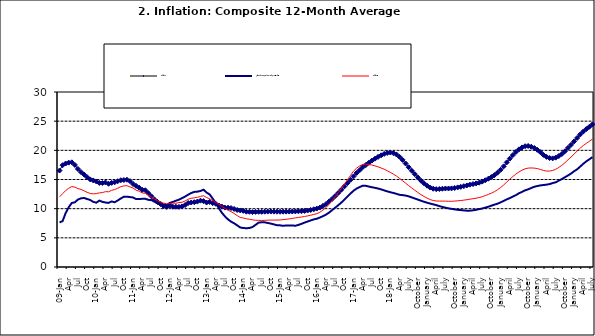
| Category | Series 0 | All Items less Farm Produce and Energy | Series 2 |
|---|---|---|---|
| 09-Jan | 16.536 | 7.643 | 12.032 |
| Feb | 17.454 | 7.869 | 12.567 |
| Mar | 17.742 | 9.25 | 13.101 |
| Apr | 17.89 | 10.241 | 13.51 |
| May | 17.949 | 10.981 | 13.787 |
| June | 17.498 | 11.083 | 13.694 |
| Jul | 16.808 | 11.564 | 13.437 |
| Aug | 16.278 | 11.773 | 13.307 |
| Sep | 15.859 | 11.834 | 13.065 |
| Oct | 15.396 | 11.658 | 12.803 |
| Nov | 15.018 | 11.492 | 12.609 |
| Dec | 14.841 | 11.171 | 12.538 |
| 10-Jan | 14.668 | 11.027 | 12.586 |
| Feb | 14.411 | 11.382 | 12.7 |
| Mar | 14.395 | 11.166 | 12.757 |
| Apr | 14.489 | 11.054 | 12.915 |
| May | 14.266 | 10.986 | 12.893 |
| Jun | 14.424 | 11.243 | 13.132 |
| Jul | 14.514 | 11.094 | 13.284 |
| Aug | 14.706 | 11.408 | 13.5 |
| Sep | 14.872 | 11.749 | 13.764 |
| Oct | 14.906 | 12.042 | 13.908 |
| Nov | 14.967 | 12.063 | 13.928 |
| Dec | 14.723 | 11.985 | 13.74 |
| 11-Jan | 14.233 | 11.923 | 13.542 |
| Feb | 13.903 | 11.643 | 13.161 |
| Mar | 13.606 | 11.651 | 13.001 |
| Apr | 13.227 | 11.687 | 12.694 |
| May | 13.152 | 11.691 | 12.648 |
| Jun | 12.654 | 11.513 | 12.321 |
| Jul | 12.118 | 11.467 | 12.009 |
| Aug | 11.575 | 11.186 | 11.635 |
| Sep | 11.155 | 10.893 | 11.363 |
| Oct | 10.797 | 10.708 | 11.13 |
| Nov | 10.422 | 10.679 | 10.952 |
| Dec | 10.298 | 10.638 | 10.826 |
| 12-Jan | 10.538 | 10.992 | 10.886 |
| 12-Feb | 10.336 | 11.159 | 10.955 |
| 12-Mar | 10.325 | 11.361 | 10.914 |
| Apr | 10.304 | 11.548 | 11.054 |
| May | 10.387 | 11.8 | 11.096 |
| Jun | 10.617 | 12.085 | 11.32 |
| Jul | 10.963 | 12.397 | 11.599 |
| Aug | 11.056 | 12.685 | 11.791 |
| Sep | 11.104 | 12.874 | 11.859 |
| Oct | 11.216 | 12.918 | 11.948 |
| Nov | 11.372 | 13.024 | 12.091 |
| Dec | 11.296 | 13.26 | 12.224 |
| 13-Jan | 11.055 | 12.762 | 11.908 |
| Feb | 11.153 | 12.455 | 11.703 |
| Mar | 10.951 | 11.733 | 11.394 |
| Apr | 10.844 | 10.99 | 11.072 |
| May | 10.548 | 10.09 | 10.761 |
| Jun | 10.352 | 9.301 | 10.383 |
| Jul | 10.186 | 8.681 | 10.047 |
| Aug | 10.168 | 8.164 | 9.761 |
| Sep | 10.105 | 7.78 | 9.486 |
| Oct | 9.955 | 7.487 | 9.167 |
| Nov | 9.774 | 7.141 | 8.815 |
| Dec | 9.695 | 6.777 | 8.496 |
| 14-Jan | 9.626 | 6.685 | 8.408 |
| Feb | 9.484 | 6.648 | 8.257 |
| Mar | 9.464 | 6.687 | 8.19 |
| Apr | 9.416 | 6.852 | 8.092 |
| May | 9.448 | 7.223 | 8.012 |
| Jun | 9.464 | 7.606 | 7.998 |
| Jul | 9.459 | 7.668 | 7.968 |
| Aug | 9.481 | 7.652 | 7.996 |
| Sep | 9.501 | 7.551 | 8.027 |
| Oct | 9.508 | 7.437 | 8.047 |
| Nov | 9.492 | 7.309 | 8.046 |
| Dec | 9.481 | 7.16 | 8.047 |
| 15-Jan | 9.475 | 7.137 | 8.063 |
| Feb | 9.486 | 7.062 | 8.117 |
| Mar | 9.495 | 7.122 | 8.176 |
| Apr | 9.501 | 7.131 | 8.243 |
| May | 9.51 | 7.115 | 8.331 |
| Jun | 9.535 | 7.073 | 8.417 |
| Jul | 9.552 | 7.215 | 8.497 |
| Aug | 9.571 | 7.401 | 8.566 |
| Sep | 9.614 | 7.612 | 8.658 |
| Oct | 9.68 | 7.8 | 8.76 |
| Nov | 9.778 | 7.981 | 8.879 |
| Dec | 9.898 | 8.16 | 9.009 |
| 16-Jan | 10.017 | 8.277 | 9.13 |
| Feb | 10.184 | 8.477 | 9.386 |
| Mar | 10.471 | 8.717 | 9.751 |
| Apr | 10.786 | 8.98 | 10.182 |
| May | 11.221 | 9.325 | 10.746 |
| Jun | 11.672 | 9.749 | 11.372 |
| Jul | 12.162 | 10.167 | 12.045 |
| Aug | 12.696 | 10.594 | 12.744 |
| Sep | 13.238 | 11.043 | 13.454 |
| Oct | 13.817 | 11.544 | 14.206 |
| Nov | 14.386 | 12.074 | 14.958 |
| Dec | 14.946 | 12.589 | 15.697 |
| 17-Jan | 15.536 | 13.081 | 16.441 |
| Feb | 16.127 | 13.445 | 16.958 |
| Mar | 16.598 | 13.706 | 17.315 |
| Apr | 17.106 | 13.94 | 17.591 |
| May | 17.477 | 13.915 | 17.628 |
| Jun | 17.868 | 13.792 | 17.578 |
| Jul | 18.247 | 13.675 | 17.475 |
| Aug | 18.569 | 13.573 | 17.331 |
| Sep | 18.876 | 13.455 | 17.17 |
| Oct | 19.14 | 13.303 | 16.968 |
| Nov | 19.392 | 13.133 | 16.76 |
| Dec | 19.546 | 12.966 | 16.502 |
| 18-Jan | 19.621 | 12.821 | 16.215 |
| Feb | 19.521 | 12.691 | 15.93 |
| Mar | 19.294 | 12.548 | 15.599 |
| Apr | 18.886 | 12.377 | 15.196 |
| May | 18.359 | 12.323 | 14.793 |
| June | 17.745 | 12.247 | 14.371 |
| July | 17.102 | 12.112 | 13.95 |
| August | 16.501 | 11.933 | 13.546 |
| September | 15.923 | 11.743 | 13.157 |
| October | 15.355 | 11.556 | 12.777 |
| November | 14.802 | 11.365 | 12.406 |
| December | 14.348 | 11.187 | 12.095 |
| January | 13.934 | 11.022 | 11.801 |
| February | 13.62 | 10.877 | 11.564 |
| March | 13.42 | 10.745 | 11.401 |
| April | 13.339 | 10.605 | 11.314 |
| May | 13.371 | 10.443 | 11.299 |
| June | 13.418 | 10.289 | 11.297 |
| July | 13.46 | 10.172 | 11.291 |
| August | 13.458 | 10.053 | 11.271 |
| September | 13.474 | 9.966 | 11.268 |
| October | 13.544 | 9.879 | 11.298 |
| November | 13.646 | 9.8 | 11.348 |
| December | 13.743 | 9.763 | 11.396 |
| January | 13.859 | 9.7 | 11.462 |
| February | 13.98 | 9.656 | 11.539 |
| March | 14.109 | 9.659 | 11.624 |
| April | 14.221 | 9.716 | 11.706 |
| May | 14.325 | 9.807 | 11.791 |
| June | 14.46 | 9.925 | 11.904 |
| July | 14.634 | 10.027 | 12.049 |
| August | 14.869 | 10.181 | 12.233 |
| September | 15.135 | 10.326 | 12.44 |
| October | 15.416 | 10.516 | 12.664 |
| November | 15.746 | 10.692 | 12.923 |
| December | 16.169 | 10.851 | 13.246 |
| January | 16.662 | 11.077 | 13.616 |
| February | 17.251 | 11.331 | 14.053 |
| March | 17.929 | 11.584 | 14.554 |
| April | 18.576 | 11.815 | 15.039 |
| May | 19.176 | 12.073 | 15.499 |
| June | 19.721 | 12.318 | 15.927 |
| July | 20.165 | 12.637 | 16.298 |
| August | 20.499 | 12.878 | 16.601 |
| September | 20.711 | 13.143 | 16.83 |
| October | 20.753 | 13.312 | 16.958 |
| November | 20.619 | 13.543 | 16.979 |
| December | 20.403 | 13.748 | 16.953 |
| January | 20.089 | 13.883 | 16.869 |
| February | 19.687 | 13.989 | 16.728 |
| March | 19.214 | 14.054 | 16.544 |
| April | 18.876 | 14.121 | 16.449 |
| May | 18.679 | 14.212 | 16.449 |
| June | 18.619 | 14.385 | 16.542 |
| July | 18.745 | 14.529 | 16.755 |
| August | 19.021 | 14.801 | 17.07 |
| September | 19.365 | 15.073 | 17.432 |
| October | 19.829 | 15.384 | 17.865 |
| November | 20.407 | 15.69 | 18.372 |
| December | 20.937 | 16.016 | 18.847 |
| January | 21.53 | 16.413 | 19.362 |
| February | 22.124 | 16.752 | 19.873 |
| March | 22.715 | 17.216 | 20.375 |
| April | 23.222 | 17.698 | 20.816 |
| May | 23.654 | 18.11 | 21.2 |
| June | 24.033 | 18.47 | 21.544 |
| July | 24.458 | 18.837 | 21.92 |